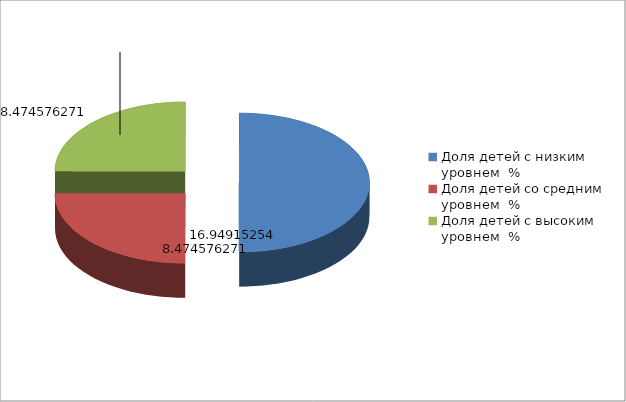
| Category | Series 0 |
|---|---|
| Доля детей с низким уровнем  % | 16.949 |
| Доля детей со средним уровнем  % | 8.475 |
| Доля детей с высоким уровнем  % | 8.475 |